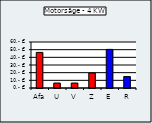
| Category | Motorsäge - 4 KW |
|---|---|
| Afa | 46.429 |
| U | 6.5 |
| V | 6.5 |
| Z | 19.5 |
| E | 50.37 |
| R | 14.95 |